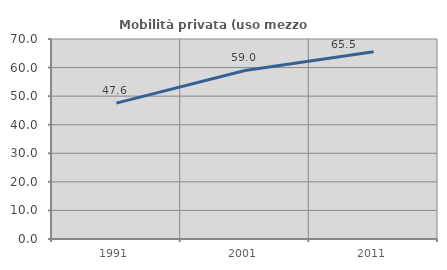
| Category | Mobilità privata (uso mezzo privato) |
|---|---|
| 1991.0 | 47.555 |
| 2001.0 | 58.991 |
| 2011.0 | 65.535 |